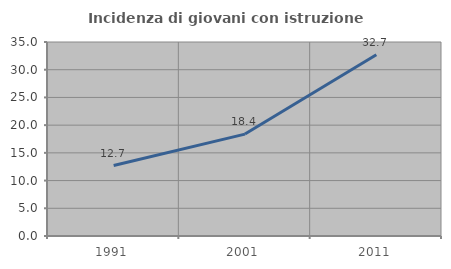
| Category | Incidenza di giovani con istruzione universitaria |
|---|---|
| 1991.0 | 12.716 |
| 2001.0 | 18.386 |
| 2011.0 | 32.695 |